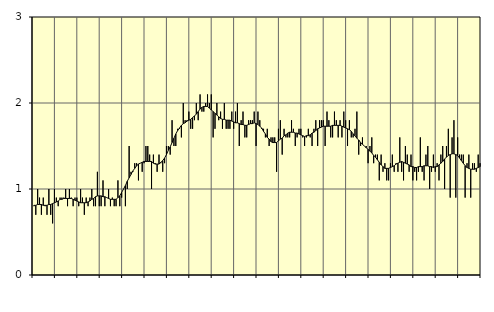
| Category | Sysselsatta utomlands | Series 1 |
|---|---|---|
| nan | 0.8 | 0.81 |
| 1.0 | 0.7 | 0.81 |
| 1.0 | 1 | 0.82 |
| 1.0 | 0.9 | 0.82 |
| 1.0 | 0.7 | 0.82 |
| 1.0 | 0.9 | 0.81 |
| 1.0 | 0.8 | 0.81 |
| 1.0 | 0.7 | 0.81 |
| 1.0 | 1 | 0.82 |
| 1.0 | 0.7 | 0.82 |
| 1.0 | 0.6 | 0.83 |
| 1.0 | 1 | 0.84 |
| nan | 0.9 | 0.85 |
| 2.0 | 0.8 | 0.86 |
| 2.0 | 0.9 | 0.88 |
| 2.0 | 0.9 | 0.88 |
| 2.0 | 0.9 | 0.89 |
| 2.0 | 1 | 0.89 |
| 2.0 | 0.8 | 0.89 |
| 2.0 | 1 | 0.89 |
| 2.0 | 0.9 | 0.89 |
| 2.0 | 0.8 | 0.88 |
| 2.0 | 0.9 | 0.87 |
| 2.0 | 0.9 | 0.86 |
| nan | 0.8 | 0.85 |
| 3.0 | 1 | 0.84 |
| 3.0 | 0.9 | 0.84 |
| 3.0 | 0.7 | 0.84 |
| 3.0 | 0.9 | 0.84 |
| 3.0 | 0.8 | 0.85 |
| 3.0 | 0.9 | 0.86 |
| 3.0 | 1 | 0.88 |
| 3.0 | 0.8 | 0.89 |
| 3.0 | 0.8 | 0.91 |
| 3.0 | 1.2 | 0.92 |
| 3.0 | 0.8 | 0.92 |
| nan | 0.8 | 0.92 |
| 4.0 | 1.1 | 0.91 |
| 4.0 | 0.8 | 0.91 |
| 4.0 | 0.9 | 0.9 |
| 4.0 | 1 | 0.89 |
| 4.0 | 0.8 | 0.88 |
| 4.0 | 0.9 | 0.88 |
| 4.0 | 0.8 | 0.88 |
| 4.0 | 0.8 | 0.88 |
| 4.0 | 1.1 | 0.9 |
| 4.0 | 0.8 | 0.92 |
| 4.0 | 0.9 | 0.96 |
| nan | 1 | 1 |
| 5.0 | 0.8 | 1.04 |
| 5.0 | 1 | 1.09 |
| 5.0 | 1.5 | 1.13 |
| 5.0 | 1.2 | 1.17 |
| 5.0 | 1.2 | 1.21 |
| 5.0 | 1.3 | 1.24 |
| 5.0 | 1.3 | 1.27 |
| 5.0 | 1.1 | 1.29 |
| 5.0 | 1.3 | 1.3 |
| 5.0 | 1.2 | 1.31 |
| 5.0 | 1.3 | 1.32 |
| nan | 1.5 | 1.32 |
| 6.0 | 1.5 | 1.32 |
| 6.0 | 1.4 | 1.32 |
| 6.0 | 1 | 1.32 |
| 6.0 | 1.4 | 1.3 |
| 6.0 | 1.3 | 1.29 |
| 6.0 | 1.2 | 1.29 |
| 6.0 | 1.4 | 1.29 |
| 6.0 | 1.3 | 1.31 |
| 6.0 | 1.2 | 1.33 |
| 6.0 | 1.3 | 1.36 |
| 6.0 | 1.5 | 1.4 |
| nan | 1.5 | 1.45 |
| 7.0 | 1.4 | 1.49 |
| 7.0 | 1.8 | 1.54 |
| 7.0 | 1.5 | 1.59 |
| 7.0 | 1.5 | 1.64 |
| 7.0 | 1.7 | 1.68 |
| 7.0 | 1.7 | 1.71 |
| 7.0 | 1.6 | 1.74 |
| 7.0 | 2 | 1.76 |
| 7.0 | 1.8 | 1.77 |
| 7.0 | 1.8 | 1.79 |
| 7.0 | 1.9 | 1.8 |
| nan | 1.7 | 1.81 |
| 8.0 | 1.7 | 1.83 |
| 8.0 | 1.8 | 1.85 |
| 8.0 | 2 | 1.87 |
| 8.0 | 1.8 | 1.9 |
| 8.0 | 2.1 | 1.93 |
| 8.0 | 1.9 | 1.95 |
| 8.0 | 1.9 | 1.96 |
| 8.0 | 2 | 1.96 |
| 8.0 | 2.1 | 1.96 |
| 8.0 | 2 | 1.94 |
| 8.0 | 2.1 | 1.92 |
| nan | 1.6 | 1.9 |
| 9.0 | 1.7 | 1.88 |
| 9.0 | 2 | 1.86 |
| 9.0 | 1.8 | 1.84 |
| 9.0 | 1.9 | 1.82 |
| 9.0 | 1.7 | 1.81 |
| 9.0 | 2 | 1.81 |
| 9.0 | 1.7 | 1.8 |
| 9.0 | 1.7 | 1.8 |
| 9.0 | 1.7 | 1.8 |
| 9.0 | 1.9 | 1.79 |
| 9.0 | 1.7 | 1.78 |
| nan | 1.9 | 1.77 |
| 10.0 | 2 | 1.77 |
| 10.0 | 1.5 | 1.76 |
| 10.0 | 1.8 | 1.75 |
| 10.0 | 1.9 | 1.75 |
| 10.0 | 1.6 | 1.74 |
| 10.0 | 1.6 | 1.74 |
| 10.0 | 1.8 | 1.75 |
| 10.0 | 1.8 | 1.76 |
| 10.0 | 1.8 | 1.76 |
| 10.0 | 1.9 | 1.77 |
| 10.0 | 1.5 | 1.76 |
| nan | 1.9 | 1.75 |
| 11.0 | 1.8 | 1.73 |
| 11.0 | 1.7 | 1.71 |
| 11.0 | 1.7 | 1.67 |
| 11.0 | 1.6 | 1.64 |
| 11.0 | 1.7 | 1.6 |
| 11.0 | 1.5 | 1.58 |
| 11.0 | 1.6 | 1.55 |
| 11.0 | 1.6 | 1.54 |
| 11.0 | 1.6 | 1.54 |
| 11.0 | 1.2 | 1.54 |
| 11.0 | 1.7 | 1.56 |
| nan | 1.8 | 1.58 |
| 12.0 | 1.4 | 1.59 |
| 12.0 | 1.7 | 1.62 |
| 12.0 | 1.6 | 1.63 |
| 12.0 | 1.6 | 1.65 |
| 12.0 | 1.6 | 1.66 |
| 12.0 | 1.8 | 1.66 |
| 12.0 | 1.7 | 1.66 |
| 12.0 | 1.5 | 1.65 |
| 12.0 | 1.6 | 1.65 |
| 12.0 | 1.7 | 1.64 |
| 12.0 | 1.7 | 1.63 |
| nan | 1.6 | 1.62 |
| 13.0 | 1.5 | 1.61 |
| 13.0 | 1.6 | 1.62 |
| 13.0 | 1.7 | 1.62 |
| 13.0 | 1.6 | 1.63 |
| 13.0 | 1.5 | 1.65 |
| 13.0 | 1.7 | 1.66 |
| 13.0 | 1.8 | 1.68 |
| 13.0 | 1.5 | 1.7 |
| 13.0 | 1.8 | 1.71 |
| 13.0 | 1.8 | 1.72 |
| 13.0 | 1.8 | 1.73 |
| nan | 1.5 | 1.73 |
| 14.0 | 1.9 | 1.73 |
| 14.0 | 1.8 | 1.73 |
| 14.0 | 1.6 | 1.73 |
| 14.0 | 1.6 | 1.74 |
| 14.0 | 1.9 | 1.74 |
| 14.0 | 1.8 | 1.74 |
| 14.0 | 1.6 | 1.74 |
| 14.0 | 1.8 | 1.74 |
| 14.0 | 1.6 | 1.73 |
| 14.0 | 1.9 | 1.72 |
| 14.0 | 1.8 | 1.71 |
| nan | 1.5 | 1.7 |
| 15.0 | 1.8 | 1.69 |
| 15.0 | 1.6 | 1.67 |
| 15.0 | 1.6 | 1.64 |
| 15.0 | 1.7 | 1.62 |
| 15.0 | 1.9 | 1.59 |
| 15.0 | 1.4 | 1.57 |
| 15.0 | 1.5 | 1.54 |
| 15.0 | 1.6 | 1.52 |
| 15.0 | 1.5 | 1.5 |
| 15.0 | 1.5 | 1.48 |
| 15.0 | 1.3 | 1.46 |
| nan | 1.5 | 1.44 |
| 16.0 | 1.6 | 1.42 |
| 16.0 | 1.3 | 1.39 |
| 16.0 | 1.4 | 1.37 |
| 16.0 | 1.4 | 1.34 |
| 16.0 | 1.1 | 1.31 |
| 16.0 | 1.4 | 1.28 |
| 16.0 | 1.2 | 1.26 |
| 16.0 | 1.3 | 1.24 |
| 16.0 | 1.1 | 1.24 |
| 16.0 | 1.1 | 1.24 |
| 16.0 | 1.3 | 1.25 |
| nan | 1.4 | 1.26 |
| 17.0 | 1.2 | 1.27 |
| 17.0 | 1.3 | 1.29 |
| 17.0 | 1.2 | 1.3 |
| 17.0 | 1.6 | 1.31 |
| 17.0 | 1.2 | 1.32 |
| 17.0 | 1.1 | 1.31 |
| 17.0 | 1.5 | 1.3 |
| 17.0 | 1.4 | 1.29 |
| 17.0 | 1.2 | 1.28 |
| 17.0 | 1.4 | 1.26 |
| 17.0 | 1.1 | 1.26 |
| nan | 1.2 | 1.25 |
| 18.0 | 1.1 | 1.25 |
| 18.0 | 1.2 | 1.26 |
| 18.0 | 1.6 | 1.26 |
| 18.0 | 1.2 | 1.26 |
| 18.0 | 1.1 | 1.27 |
| 18.0 | 1.4 | 1.27 |
| 18.0 | 1.5 | 1.27 |
| 18.0 | 1 | 1.26 |
| 18.0 | 1.2 | 1.26 |
| 18.0 | 1.4 | 1.25 |
| 18.0 | 1.2 | 1.26 |
| nan | 1.3 | 1.26 |
| 19.0 | 1.1 | 1.28 |
| 19.0 | 1.4 | 1.3 |
| 19.0 | 1.5 | 1.32 |
| 19.0 | 1 | 1.35 |
| 19.0 | 1.5 | 1.37 |
| 19.0 | 1.7 | 1.39 |
| 19.0 | 0.9 | 1.4 |
| 19.0 | 1.6 | 1.41 |
| 19.0 | 1.8 | 1.41 |
| 19.0 | 0.9 | 1.4 |
| 19.0 | 1.6 | 1.39 |
| nan | 1.4 | 1.36 |
| 20.0 | 1.4 | 1.33 |
| 20.0 | 1.4 | 1.3 |
| 20.0 | 0.9 | 1.27 |
| 20.0 | 1.3 | 1.25 |
| 20.0 | 1.4 | 1.24 |
| 20.0 | 0.9 | 1.23 |
| 20.0 | 1.3 | 1.23 |
| 20.0 | 1.3 | 1.23 |
| 20.0 | 1.2 | 1.24 |
| 20.0 | 1.4 | 1.25 |
| 20.0 | 1.3 | 1.26 |